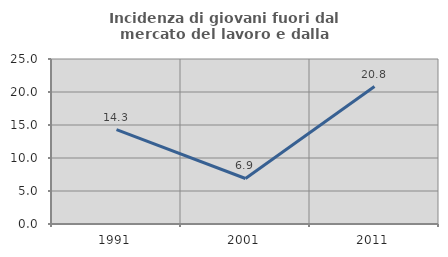
| Category | Incidenza di giovani fuori dal mercato del lavoro e dalla formazione  |
|---|---|
| 1991.0 | 14.286 |
| 2001.0 | 6.897 |
| 2011.0 | 20.833 |